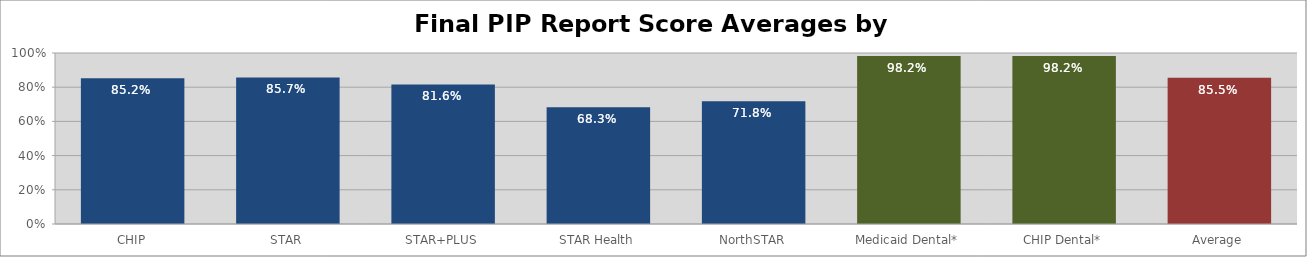
| Category | Final PIP Report
Averages |
|---|---|
| CHIP | 0.852 |
| STAR | 0.857 |
| STAR+PLUS | 0.816 |
| STAR Health | 0.683 |
| NorthSTAR | 0.718 |
| Medicaid Dental* | 0.982 |
| CHIP Dental* | 0.982 |
| Average | 0.855 |